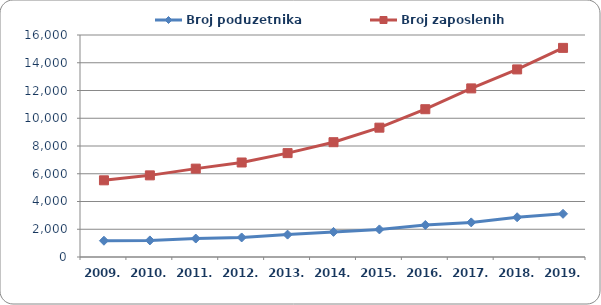
| Category | Broj poduzetnika  | Broj zaposlenih  |
|---|---|---|
| 2009. | 1173 | 5526 |
| 2010. | 1195 | 5884 |
| 2011. | 1330 | 6369 |
| 2012. | 1408 | 6811 |
| 2013. | 1613 | 7487 |
| 2014. | 1809 | 8274 |
| 2015. | 1988 | 9321 |
| 2016. | 2307 | 10652 |
| 2017. | 2494 | 12152 |
| 2018. | 2865 | 13520 |
| 2019. | 3112 | 15072 |